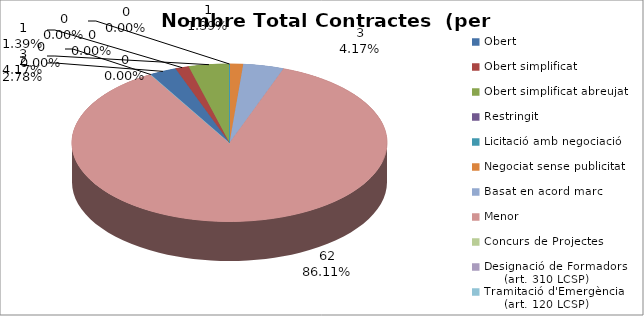
| Category | Nombre Total Contractes |
|---|---|
| Obert | 2 |
| Obert simplificat | 1 |
| Obert simplificat abreujat | 3 |
| Restringit | 0 |
| Licitació amb negociació | 0 |
| Negociat sense publicitat | 1 |
| Basat en acord marc | 3 |
| Menor | 62 |
| Concurs de Projectes | 0 |
| Designació de Formadors
     (art. 310 LCSP) | 0 |
| Tramitació d'Emergència
     (art. 120 LCSP) | 0 |